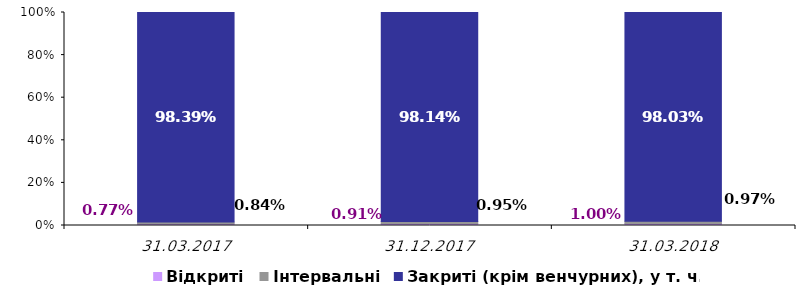
| Category | Відкриті | Інтервальні | Закриті (крім венчурних), у т. ч.: |
|---|---|---|---|
| 31.03.2017 | 0.008 | 0.008 | 0.984 |
| 31.12.2017 | 0.009 | 0.009 | 0.981 |
| 31.03.2018 | 0.01 | 0.01 | 0.98 |